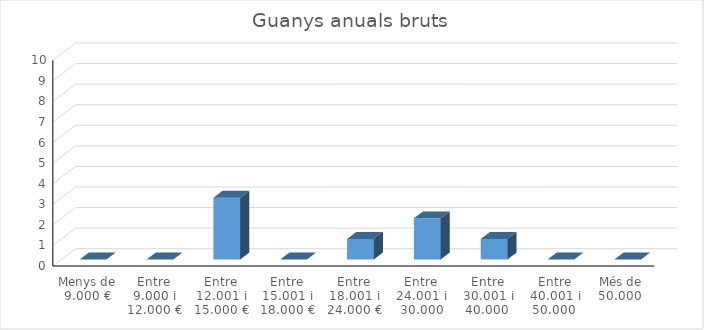
| Category | Series 0 |
|---|---|
| Menys de 9.000 € | 0 |
| Entre 9.000 i 12.000 € | 0 |
| Entre 12.001 i 15.000 € | 3 |
| Entre 15.001 i 18.000 € | 0 |
| Entre 18.001 i 24.000 € | 1 |
| Entre 24.001 i 30.000 | 2 |
| Entre 30.001 i 40.000  | 1 |
| Entre 40.001 i 50.000  | 0 |
| Més de 50.000  | 0 |